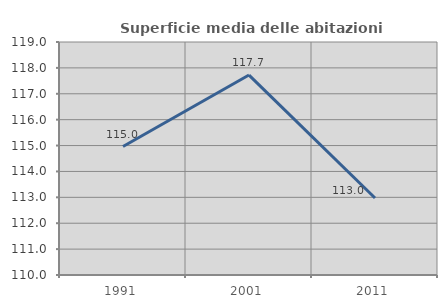
| Category | Superficie media delle abitazioni occupate |
|---|---|
| 1991.0 | 114.962 |
| 2001.0 | 117.723 |
| 2011.0 | 112.973 |